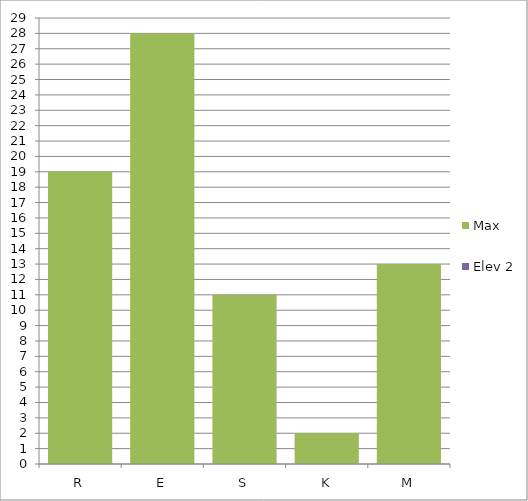
| Category | Max | Elev 2 |
|---|---|---|
| R | 19 | 0 |
| E | 28 | 0 |
| S | 11 | 0 |
| K | 2 | 0 |
| M | 13 | 0 |